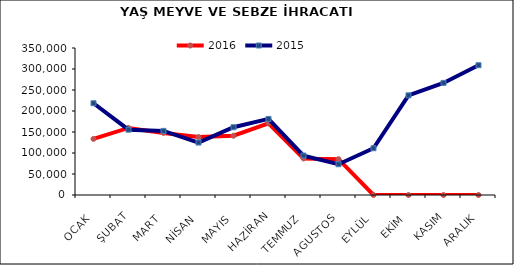
| Category | 2016 | 2015 |
|---|---|---|
| OCAK | 133664.503 | 218481.598 |
| ŞUBAT | 159695.396 | 155554.297 |
| MART | 147822.735 | 152629.234 |
| NİSAN | 137978.89 | 124853.161 |
| MAYIS | 141131.489 | 161353.406 |
| HAZİRAN | 170622.737 | 181166.303 |
| TEMMUZ | 87141.013 | 93843.734 |
| AGUSTOS | 85245.125 | 73244.346 |
| EYLÜL | 0 | 111339.687 |
| EKİM | 0 | 237273.415 |
| KASIM | 0 | 266870.47 |
| ARALIK | 0 | 308968.7 |